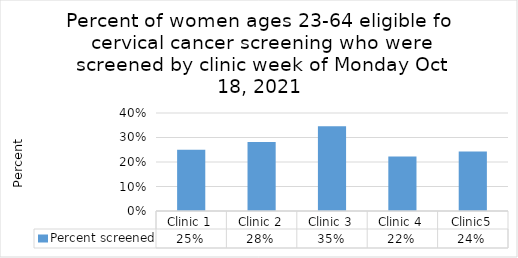
| Category | Percent screened |
|---|---|
| Clinic 1 | 0.25 |
| Clinic 2 | 0.281 |
| Clinic 3 | 0.346 |
| Clinic 4 | 0.222 |
| Clinic5 | 0.242 |